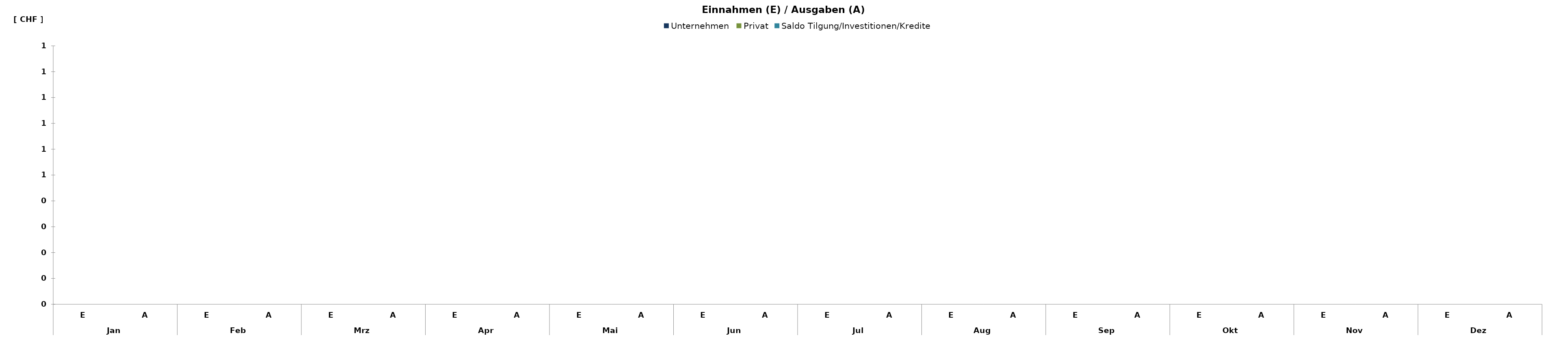
| Category | Unternehmen | Privat | Saldo Tilgung/Investitionen/Kredite |
|---|---|---|---|
| 0 | 0 | 0 | 0 |
| 1 | 0 | 0 | 0 |
| 2 | 0 | 0 | 0 |
| 3 | 0 | 0 | 0 |
| 4 | 0 | 0 | 0 |
| 5 | 0 | 0 | 0 |
| 6 | 0 | 0 | 0 |
| 7 | 0 | 0 | 0 |
| 8 | 0 | 0 | 0 |
| 9 | 0 | 0 | 0 |
| 10 | 0 | 0 | 0 |
| 11 | 0 | 0 | 0 |
| 12 | 0 | 0 | 0 |
| 13 | 0 | 0 | 0 |
| 14 | 0 | 0 | 0 |
| 15 | 0 | 0 | 0 |
| 16 | 0 | 0 | 0 |
| 17 | 0 | 0 | 0 |
| 18 | 0 | 0 | 0 |
| 19 | 0 | 0 | 0 |
| 20 | 0 | 0 | 0 |
| 21 | 0 | 0 | 0 |
| 22 | 0 | 0 | 0 |
| 23 | 0 | 0 | 0 |